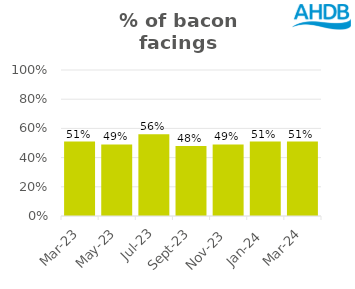
| Category | Bacon |
|---|---|
| 2023-03-01 | 0.51 |
| 2023-05-01 | 0.49 |
| 2023-07-01 | 0.56 |
| 2023-09-01 | 0.48 |
| 2023-11-01 | 0.49 |
| 2024-01-01 | 0.51 |
| 2024-03-01 | 0.51 |